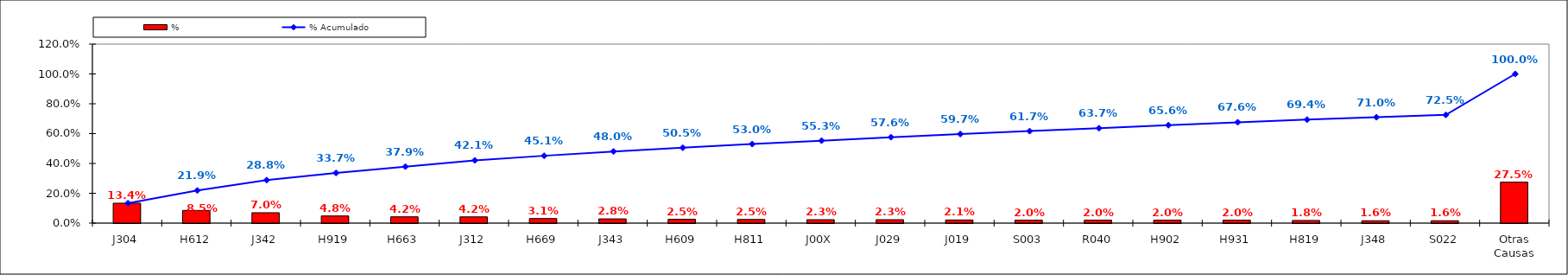
| Category | % |
|---|---|
| J304 | 0.134 |
| H612 | 0.085 |
| J342 | 0.07 |
| H919 | 0.048 |
| H663 | 0.042 |
| J312 | 0.042 |
| H669 | 0.031 |
| J343 | 0.028 |
| H609 | 0.025 |
| H811 | 0.025 |
| J00X | 0.023 |
| J029 | 0.023 |
| J019 | 0.021 |
| S003 | 0.02 |
| R040 | 0.02 |
| H902 | 0.02 |
| H931 | 0.02 |
| H819 | 0.018 |
| J348 | 0.016 |
| S022 | 0.016 |
| Otras Causas | 0.275 |